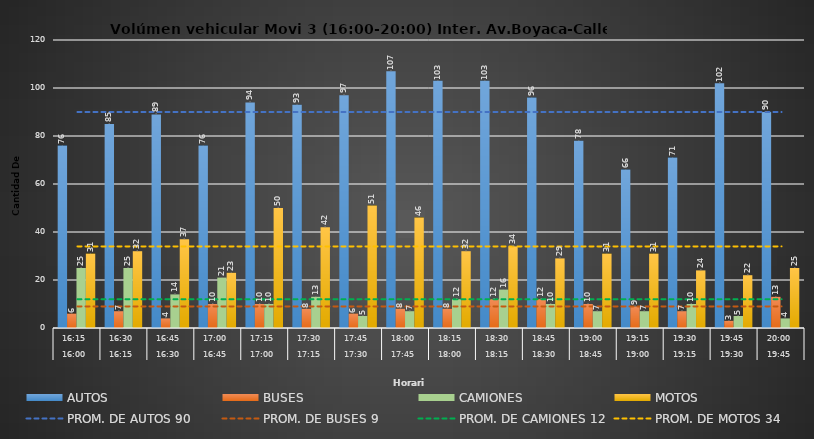
| Category | AUTOS | BUSES | CAMIONES | MOTOS |
|---|---|---|---|---|
| 0 | 76 | 6 | 25 | 31 |
| 1 | 85 | 7 | 25 | 32 |
| 2 | 89 | 4 | 14 | 37 |
| 3 | 76 | 10 | 21 | 23 |
| 4 | 94 | 10 | 10 | 50 |
| 5 | 93 | 8 | 13 | 42 |
| 6 | 97 | 6 | 5 | 51 |
| 7 | 107 | 8 | 7 | 46 |
| 8 | 103 | 8 | 12 | 32 |
| 9 | 103 | 12 | 16 | 34 |
| 10 | 96 | 12 | 10 | 29 |
| 11 | 78 | 10 | 7 | 31 |
| 12 | 66 | 9 | 7 | 31 |
| 13 | 71 | 7 | 10 | 24 |
| 14 | 102 | 3 | 5 | 22 |
| 15 | 90 | 13 | 4 | 25 |